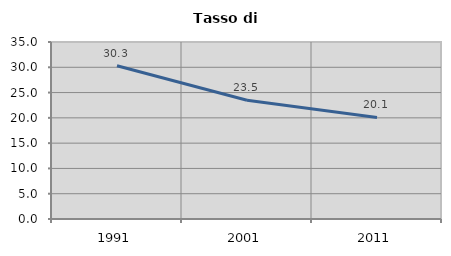
| Category | Tasso di disoccupazione   |
|---|---|
| 1991.0 | 30.297 |
| 2001.0 | 23.473 |
| 2011.0 | 20.074 |